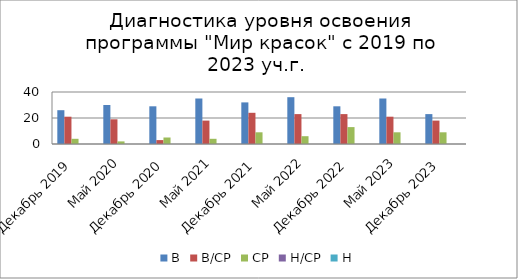
| Category | В | В/СР | СР | Н/СР | Н |
|---|---|---|---|---|---|
| Декабрь 2019 | 26 | 21 | 4 | 0 | 0 |
| Май 2020 | 30 | 19 | 2 | 0 | 0 |
| Декабрь 2020 | 29 | 3 | 5 | 0 | 0 |
| Май 2021 | 35 | 18 | 4 | 0 | 0 |
| Декабрь 2021 | 32 | 24 | 9 | 0 | 0 |
| Май 2022 | 36 | 23 | 6 | 0 | 0 |
| Декабрь 2022 | 29 | 23 | 13 | 0 | 0 |
| Май 2023 | 35 | 21 | 9 | 0 | 0 |
| Декабрь 2023 | 23 | 18 | 9 | 0 | 0 |